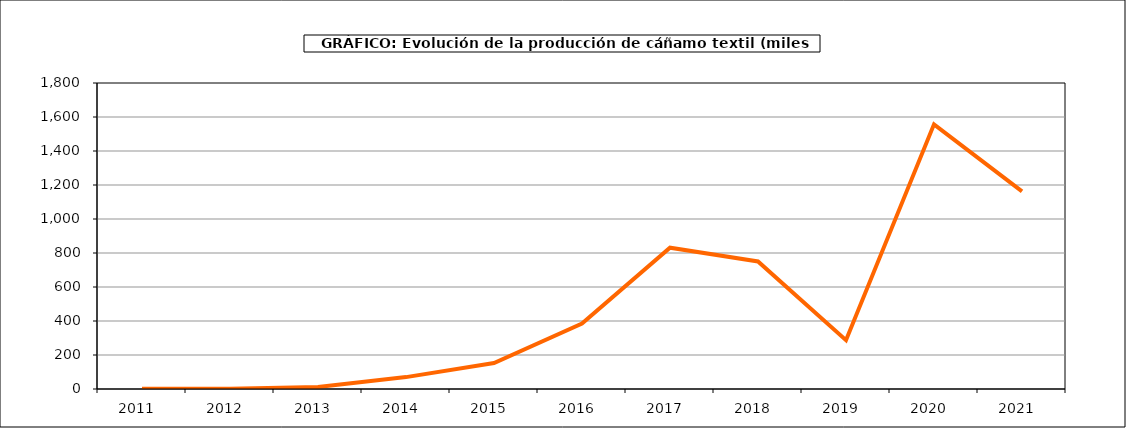
| Category | Producción |
|---|---|
| 2011.0 | 1 |
| 2012.0 | 1 |
| 2013.0 | 12 |
| 2014.0 | 70 |
| 2015.0 | 153 |
| 2016.0 | 385 |
| 2017.0 | 831 |
| 2018.0 | 750 |
| 2019.0 | 287 |
| 2020.0 | 1557 |
| 2021.0 | 1162 |